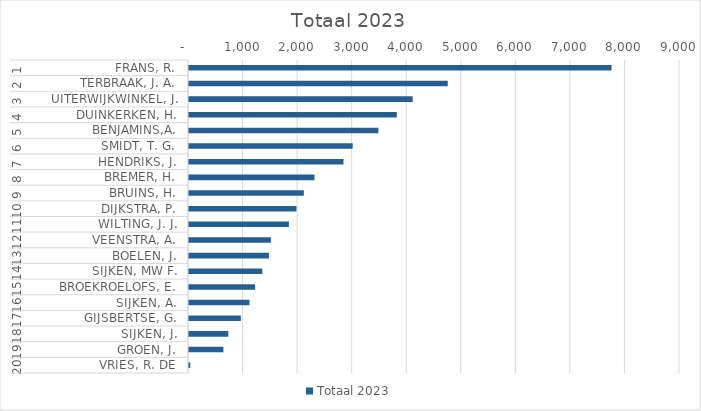
| Category | Totaal 2023 |
|---|---|
| 0 | 7746 |
| 1 | 4743 |
| 2 | 4100 |
| 3 | 3809 |
| 4 | 3472 |
| 5 | 3000 |
| 6 | 2832 |
| 7 | 2300 |
| 8 | 2105 |
| 9 | 1970 |
| 10 | 1831 |
| 11 | 1500 |
| 12 | 1464 |
| 13 | 1344 |
| 14 | 1211 |
| 15 | 1109 |
| 16 | 950 |
| 17 | 721 |
| 18 | 631 |
| 19 | 23 |